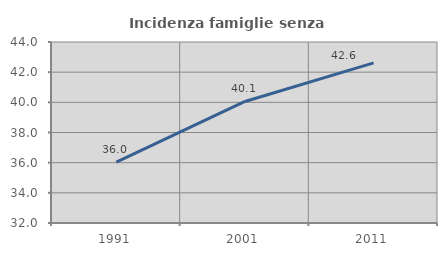
| Category | Incidenza famiglie senza nuclei |
|---|---|
| 1991.0 | 36.033 |
| 2001.0 | 40.057 |
| 2011.0 | 42.614 |